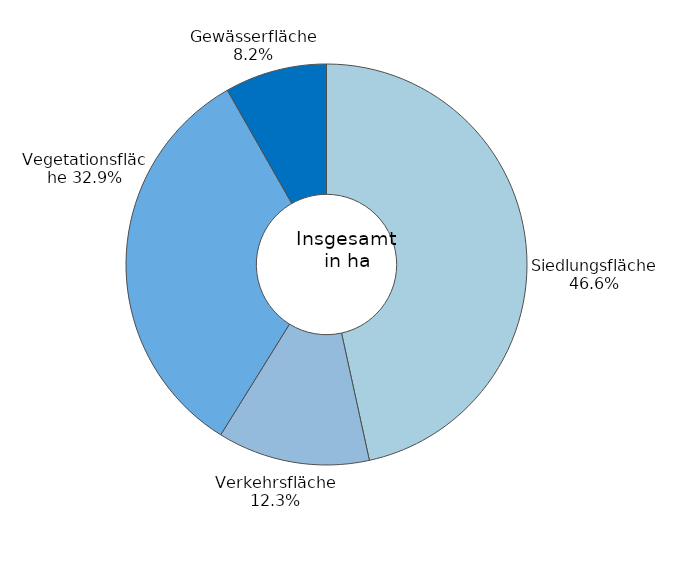
| Category | Series 0 |
|---|---|
| Siedlungsfläche | 0.466 |
| Verkehrsfläche | 0.123 |
| Vegetationsfläche | 0.329 |
| Gewässerfläche | 0.082 |